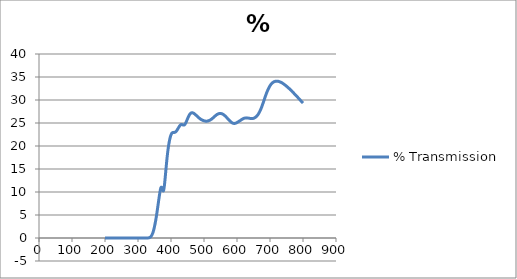
| Category | % Transmission |
|---|---|
| 800.0 | 29.326 |
| 799.0 | 29.408 |
| 798.0 | 29.476 |
| 797.0 | 29.574 |
| 796.0 | 29.648 |
| 795.0 | 29.703 |
| 794.0 | 29.803 |
| 793.0 | 29.878 |
| 792.0 | 29.945 |
| 791.0 | 30.029 |
| 790.0 | 30.11 |
| 789.0 | 30.184 |
| 788.0 | 30.261 |
| 787.0 | 30.337 |
| 786.0 | 30.415 |
| 785.0 | 30.502 |
| 784.0 | 30.579 |
| 783.0 | 30.653 |
| 782.0 | 30.735 |
| 781.0 | 30.801 |
| 780.0 | 30.877 |
| 779.0 | 30.946 |
| 778.0 | 31.04 |
| 777.0 | 31.105 |
| 776.0 | 31.191 |
| 775.0 | 31.268 |
| 774.0 | 31.34 |
| 773.0 | 31.403 |
| 772.0 | 31.506 |
| 771.0 | 31.567 |
| 770.0 | 31.648 |
| 769.0 | 31.703 |
| 768.0 | 31.781 |
| 767.0 | 31.864 |
| 766.0 | 31.947 |
| 765.0 | 31.998 |
| 764.0 | 32.076 |
| 763.0 | 32.148 |
| 762.0 | 32.207 |
| 761.0 | 32.294 |
| 760.0 | 32.377 |
| 759.0 | 32.416 |
| 758.0 | 32.509 |
| 757.0 | 32.553 |
| 756.0 | 32.618 |
| 755.0 | 32.682 |
| 754.0 | 32.762 |
| 753.0 | 32.799 |
| 752.0 | 32.876 |
| 751.0 | 32.955 |
| 750.0 | 32.986 |
| 749.0 | 33.061 |
| 748.0 | 33.12 |
| 747.0 | 33.183 |
| 746.0 | 33.234 |
| 745.0 | 33.306 |
| 744.0 | 33.333 |
| 743.0 | 33.401 |
| 742.0 | 33.46 |
| 741.0 | 33.496 |
| 740.0 | 33.554 |
| 739.0 | 33.592 |
| 738.0 | 33.644 |
| 737.0 | 33.686 |
| 736.0 | 33.751 |
| 735.0 | 33.766 |
| 734.0 | 33.821 |
| 733.0 | 33.849 |
| 732.0 | 33.865 |
| 731.0 | 33.908 |
| 730.0 | 33.945 |
| 729.0 | 33.963 |
| 728.0 | 33.997 |
| 727.0 | 34.025 |
| 726.0 | 34.035 |
| 725.0 | 34.062 |
| 724.0 | 34.072 |
| 723.0 | 34.076 |
| 722.0 | 34.102 |
| 721.0 | 34.095 |
| 720.0 | 34.076 |
| 719.0 | 34.095 |
| 718.0 | 34.097 |
| 717.0 | 34.069 |
| 716.0 | 34.062 |
| 715.0 | 34.036 |
| 714.0 | 34.007 |
| 713.0 | 33.985 |
| 712.0 | 33.97 |
| 711.0 | 33.916 |
| 710.0 | 33.879 |
| 709.0 | 33.832 |
| 708.0 | 33.748 |
| 707.0 | 33.705 |
| 706.0 | 33.644 |
| 705.0 | 33.557 |
| 704.0 | 33.481 |
| 703.0 | 33.396 |
| 702.0 | 33.291 |
| 701.0 | 33.188 |
| 700.0 | 33.091 |
| 699.0 | 32.968 |
| 698.0 | 32.843 |
| 697.0 | 32.706 |
| 696.0 | 32.552 |
| 695.0 | 32.419 |
| 694.0 | 32.263 |
| 693.0 | 32.098 |
| 692.0 | 31.946 |
| 691.0 | 31.771 |
| 690.0 | 31.581 |
| 689.0 | 31.401 |
| 688.0 | 31.191 |
| 687.0 | 31.006 |
| 686.0 | 30.804 |
| 685.0 | 30.601 |
| 684.0 | 30.388 |
| 683.0 | 30.189 |
| 682.0 | 29.962 |
| 681.0 | 29.75 |
| 680.0 | 29.541 |
| 679.0 | 29.327 |
| 678.0 | 29.131 |
| 677.0 | 28.914 |
| 676.0 | 28.712 |
| 675.0 | 28.525 |
| 674.0 | 28.338 |
| 673.0 | 28.148 |
| 672.0 | 27.985 |
| 671.0 | 27.812 |
| 670.0 | 27.651 |
| 669.0 | 27.515 |
| 668.0 | 27.366 |
| 667.0 | 27.229 |
| 666.0 | 27.109 |
| 665.0 | 26.982 |
| 664.0 | 26.867 |
| 663.0 | 26.774 |
| 662.0 | 26.687 |
| 661.0 | 26.591 |
| 660.0 | 26.518 |
| 659.0 | 26.434 |
| 658.0 | 26.355 |
| 657.0 | 26.302 |
| 656.0 | 26.252 |
| 655.0 | 26.197 |
| 654.0 | 26.158 |
| 653.0 | 26.107 |
| 652.0 | 26.06 |
| 651.0 | 26.044 |
| 650.0 | 26.025 |
| 649.0 | 25.998 |
| 648.0 | 25.992 |
| 647.0 | 25.968 |
| 646.0 | 25.962 |
| 645.0 | 25.965 |
| 644.0 | 25.968 |
| 643.0 | 25.969 |
| 642.0 | 25.982 |
| 641.0 | 25.981 |
| 640.0 | 25.982 |
| 639.0 | 26.008 |
| 638.0 | 26.025 |
| 637.0 | 26.036 |
| 636.0 | 26.053 |
| 635.0 | 26.059 |
| 634.0 | 26.062 |
| 633.0 | 26.085 |
| 632.0 | 26.096 |
| 631.0 | 26.098 |
| 630.0 | 26.115 |
| 629.0 | 26.11 |
| 628.0 | 26.105 |
| 627.0 | 26.111 |
| 626.0 | 26.103 |
| 625.0 | 26.088 |
| 624.0 | 26.074 |
| 623.0 | 26.051 |
| 622.0 | 26.023 |
| 621.0 | 26.013 |
| 620.0 | 25.987 |
| 619.0 | 25.951 |
| 618.0 | 25.919 |
| 617.0 | 25.865 |
| 616.0 | 25.828 |
| 615.0 | 25.793 |
| 614.0 | 25.742 |
| 613.0 | 25.693 |
| 612.0 | 25.651 |
| 611.0 | 25.597 |
| 610.0 | 25.542 |
| 609.0 | 25.502 |
| 608.0 | 25.46 |
| 607.0 | 25.411 |
| 606.0 | 25.37 |
| 605.0 | 25.31 |
| 604.0 | 25.26 |
| 603.0 | 25.231 |
| 602.0 | 25.188 |
| 601.0 | 25.145 |
| 600.0 | 25.107 |
| 599.0 | 25.063 |
| 598.0 | 25.024 |
| 597.0 | 25 |
| 596.0 | 24.976 |
| 595.0 | 24.948 |
| 594.0 | 24.934 |
| 593.0 | 24.911 |
| 592.0 | 24.895 |
| 591.0 | 24.911 |
| 590.0 | 24.918 |
| 589.0 | 24.928 |
| 588.0 | 24.948 |
| 587.0 | 24.968 |
| 586.0 | 25.006 |
| 585.0 | 25.066 |
| 584.0 | 25.107 |
| 583.0 | 25.153 |
| 582.0 | 25.215 |
| 581.0 | 25.265 |
| 580.0 | 25.332 |
| 579.0 | 25.408 |
| 578.0 | 25.475 |
| 577.0 | 25.549 |
| 576.0 | 25.631 |
| 575.0 | 25.698 |
| 574.0 | 25.769 |
| 573.0 | 25.862 |
| 572.0 | 25.937 |
| 571.0 | 26.017 |
| 570.0 | 26.093 |
| 569.0 | 26.163 |
| 568.0 | 26.238 |
| 567.0 | 26.322 |
| 566.0 | 26.405 |
| 565.0 | 26.469 |
| 564.0 | 26.537 |
| 563.0 | 26.598 |
| 562.0 | 26.651 |
| 561.0 | 26.723 |
| 560.0 | 26.776 |
| 559.0 | 26.821 |
| 558.0 | 26.882 |
| 557.0 | 26.921 |
| 556.0 | 26.957 |
| 555.0 | 26.992 |
| 554.0 | 27.002 |
| 553.0 | 27.022 |
| 552.0 | 27.051 |
| 551.0 | 27.059 |
| 550.0 | 27.071 |
| 549.0 | 27.073 |
| 548.0 | 27.063 |
| 547.0 | 27.056 |
| 546.0 | 27.047 |
| 545.0 | 27.031 |
| 544.0 | 27.003 |
| 543.0 | 26.979 |
| 542.0 | 26.942 |
| 541.0 | 26.9 |
| 540.0 | 26.875 |
| 539.0 | 26.822 |
| 538.0 | 26.774 |
| 537.0 | 26.725 |
| 536.0 | 26.652 |
| 535.0 | 26.594 |
| 534.0 | 26.549 |
| 533.0 | 26.474 |
| 532.0 | 26.411 |
| 531.0 | 26.348 |
| 530.0 | 26.264 |
| 529.0 | 26.203 |
| 528.0 | 26.142 |
| 527.0 | 26.083 |
| 526.0 | 26.028 |
| 525.0 | 25.963 |
| 524.0 | 25.897 |
| 523.0 | 25.846 |
| 522.0 | 25.803 |
| 521.0 | 25.753 |
| 520.0 | 25.708 |
| 519.0 | 25.661 |
| 518.0 | 25.621 |
| 517.0 | 25.579 |
| 516.0 | 25.566 |
| 515.0 | 25.531 |
| 514.0 | 25.498 |
| 513.0 | 25.48 |
| 512.0 | 25.446 |
| 511.0 | 25.421 |
| 510.0 | 25.419 |
| 509.0 | 25.399 |
| 508.0 | 25.398 |
| 507.0 | 25.396 |
| 506.0 | 25.388 |
| 505.0 | 25.393 |
| 504.0 | 25.418 |
| 503.0 | 25.428 |
| 502.0 | 25.451 |
| 501.0 | 25.465 |
| 500.0 | 25.478 |
| 499.0 | 25.505 |
| 498.0 | 25.55 |
| 497.0 | 25.555 |
| 496.0 | 25.603 |
| 495.0 | 25.636 |
| 494.0 | 25.651 |
| 493.0 | 25.701 |
| 492.0 | 25.744 |
| 491.0 | 25.775 |
| 490.0 | 25.827 |
| 489.0 | 25.874 |
| 488.0 | 25.919 |
| 487.0 | 25.971 |
| 486.0 | 26.037 |
| 485.0 | 26.098 |
| 484.0 | 26.155 |
| 483.0 | 26.218 |
| 482.0 | 26.275 |
| 481.0 | 26.344 |
| 480.0 | 26.43 |
| 479.0 | 26.483 |
| 478.0 | 26.559 |
| 477.0 | 26.63 |
| 476.0 | 26.678 |
| 475.0 | 26.748 |
| 474.0 | 26.837 |
| 473.0 | 26.878 |
| 472.0 | 26.946 |
| 471.0 | 26.998 |
| 470.0 | 27.032 |
| 469.0 | 27.1 |
| 468.0 | 27.143 |
| 467.0 | 27.173 |
| 466.0 | 27.205 |
| 465.0 | 27.22 |
| 464.0 | 27.226 |
| 463.0 | 27.21 |
| 462.0 | 27.209 |
| 461.0 | 27.17 |
| 460.0 | 27.133 |
| 459.0 | 27.074 |
| 458.0 | 26.981 |
| 457.0 | 26.896 |
| 456.0 | 26.797 |
| 455.0 | 26.674 |
| 454.0 | 26.546 |
| 453.0 | 26.4 |
| 452.0 | 26.232 |
| 451.0 | 26.072 |
| 450.0 | 25.916 |
| 449.0 | 25.737 |
| 448.0 | 25.559 |
| 447.0 | 25.384 |
| 446.0 | 25.199 |
| 445.0 | 25.052 |
| 444.0 | 24.932 |
| 443.0 | 24.795 |
| 442.0 | 24.706 |
| 441.0 | 24.64 |
| 440.0 | 24.562 |
| 439.0 | 24.56 |
| 438.0 | 24.565 |
| 437.0 | 24.564 |
| 436.0 | 24.613 |
| 435.0 | 24.623 |
| 434.0 | 24.655 |
| 433.0 | 24.674 |
| 432.0 | 24.693 |
| 431.0 | 24.68 |
| 430.0 | 24.64 |
| 429.0 | 24.601 |
| 428.0 | 24.521 |
| 427.0 | 24.447 |
| 426.0 | 24.354 |
| 425.0 | 24.234 |
| 424.0 | 24.128 |
| 423.0 | 24.006 |
| 422.0 | 23.868 |
| 421.0 | 23.761 |
| 420.0 | 23.657 |
| 419.0 | 23.508 |
| 418.0 | 23.42 |
| 417.0 | 23.302 |
| 416.0 | 23.204 |
| 415.0 | 23.139 |
| 414.0 | 23.082 |
| 413.0 | 23.022 |
| 412.0 | 22.991 |
| 411.0 | 22.97 |
| 410.0 | 22.944 |
| 409.0 | 22.944 |
| 408.0 | 22.963 |
| 407.0 | 22.936 |
| 406.0 | 22.946 |
| 405.0 | 22.91 |
| 404.0 | 22.864 |
| 403.0 | 22.806 |
| 402.0 | 22.723 |
| 401.0 | 22.58 |
| 400.0 | 22.435 |
| 399.0 | 22.227 |
| 398.0 | 21.975 |
| 397.0 | 21.7 |
| 396.0 | 21.393 |
| 395.0 | 21.022 |
| 394.0 | 20.633 |
| 393.0 | 20.22 |
| 392.0 | 19.724 |
| 391.0 | 19.226 |
| 390.0 | 18.666 |
| 389.0 | 18.035 |
| 388.0 | 17.383 |
| 387.0 | 16.671 |
| 386.0 | 15.914 |
| 385.0 | 15.145 |
| 384.0 | 14.372 |
| 383.0 | 13.587 |
| 382.0 | 12.814 |
| 381.0 | 12.082 |
| 380.0 | 11.428 |
| 379.0 | 10.883 |
| 378.0 | 10.458 |
| 377.0 | 10.261 |
| 376.0 | 10.239 |
| 375.0 | 10.362 |
| 374.0 | 10.563 |
| 373.0 | 10.788 |
| 372.0 | 10.975 |
| 371.0 | 11.042 |
| 370.0 | 11.004 |
| 369.0 | 10.837 |
| 368.0 | 10.552 |
| 367.0 | 10.194 |
| 366.0 | 9.764 |
| 365.0 | 9.309 |
| 364.0 | 8.833 |
| 363.0 | 8.341 |
| 362.0 | 7.833 |
| 361.0 | 7.325 |
| 360.0 | 6.816 |
| 359.0 | 6.299 |
| 358.0 | 5.8 |
| 357.0 | 5.316 |
| 356.0 | 4.844 |
| 355.0 | 4.398 |
| 354.0 | 3.968 |
| 353.0 | 3.563 |
| 352.0 | 3.183 |
| 351.0 | 2.826 |
| 350.0 | 2.478 |
| 349.0 | 2.164 |
| 348.0 | 1.863 |
| 347.0 | 1.591 |
| 346.0 | 1.348 |
| 345.0 | 1.139 |
| 344.0 | 0.949 |
| 343.0 | 0.783 |
| 342.0 | 0.639 |
| 341.0 | 0.51 |
| 340.0 | 0.403 |
| 339.0 | 0.317 |
| 338.0 | 0.242 |
| 337.0 | 0.181 |
| 336.0 | 0.132 |
| 335.0 | 0.094 |
| 334.0 | 0.066 |
| 333.0 | 0.049 |
| 332.0 | 0.034 |
| 331.0 | 0.023 |
| 330.0 | 0.015 |
| 329.0 | 0.007 |
| 328.0 | 0.004 |
| 327.0 | 0.006 |
| 326.0 | 0.005 |
| 325.0 | 0.004 |
| 324.0 | 0.002 |
| 323.0 | 0.002 |
| 322.0 | 0.001 |
| 321.0 | 0.005 |
| 320.0 | -0.001 |
| 319.0 | 0.001 |
| 318.0 | 0.002 |
| 317.0 | 0.002 |
| 316.0 | 0.001 |
| 315.0 | -0.001 |
| 314.0 | 0.001 |
| 313.0 | 0 |
| 312.0 | 0.003 |
| 311.0 | 0.002 |
| 310.0 | -0.002 |
| 309.0 | -0.002 |
| 308.0 | 0 |
| 307.0 | 0 |
| 306.0 | 0.004 |
| 305.0 | 0.002 |
| 304.0 | -0.001 |
| 303.0 | -0.001 |
| 302.0 | 0.001 |
| 301.0 | -0.001 |
| 300.0 | 0.002 |
| 299.0 | 0.002 |
| 298.0 | -0.002 |
| 297.0 | -0.002 |
| 296.0 | 0.001 |
| 295.0 | 0 |
| 294.0 | 0.004 |
| 293.0 | 0.003 |
| 292.0 | -0.001 |
| 291.0 | -0.002 |
| 290.0 | 0 |
| 289.0 | 0 |
| 288.0 | 0.004 |
| 287.0 | 0.002 |
| 286.0 | 0.001 |
| 285.0 | 0 |
| 284.0 | 0.001 |
| 283.0 | 0 |
| 282.0 | 0.004 |
| 281.0 | 0.003 |
| 280.0 | 0 |
| 279.0 | -0.001 |
| 278.0 | 0.001 |
| 277.0 | 0.001 |
| 276.0 | 0.003 |
| 275.0 | 0.002 |
| 274.0 | 0 |
| 273.0 | 0.001 |
| 272.0 | 0.002 |
| 271.0 | 0.003 |
| 270.0 | 0.002 |
| 269.0 | 0.002 |
| 268.0 | 0.002 |
| 267.0 | 0.002 |
| 266.0 | 0.004 |
| 265.0 | 0.004 |
| 264.0 | 0.005 |
| 263.0 | 0.003 |
| 262.0 | -0.001 |
| 261.0 | -0.001 |
| 260.0 | 0 |
| 259.0 | 0 |
| 258.0 | 0.004 |
| 257.0 | 0.003 |
| 256.0 | -0.001 |
| 255.0 | -0.001 |
| 254.0 | 0.001 |
| 253.0 | 0.001 |
| 252.0 | 0.004 |
| 251.0 | 0.002 |
| 250.0 | -0.001 |
| 299.0 | 0.001 |
| 298.0 | -0.002 |
| 297.0 | 0 |
| 296.0 | 0.001 |
| 295.0 | -0.001 |
| 294.0 | 0.002 |
| 293.0 | 0.001 |
| 292.0 | -0.002 |
| 291.0 | 0.002 |
| 290.0 | 0.003 |
| 289.0 | -0.002 |
| 288.0 | -0.002 |
| 287.0 | 0 |
| 286.0 | 0.001 |
| 285.0 | 0.001 |
| 284.0 | 0 |
| 283.0 | 0.001 |
| 282.0 | 0.001 |
| 281.0 | -0.001 |
| 280.0 | -0.003 |
| 279.0 | 0 |
| 278.0 | 0.002 |
| 277.0 | 0 |
| 276.0 | 0.002 |
| 275.0 | 0.001 |
| 274.0 | -0.001 |
| 273.0 | 0.002 |
| 272.0 | 0.002 |
| 271.0 | 0 |
| 270.0 | 0.002 |
| 269.0 | 0.001 |
| 268.0 | -0.002 |
| 267.0 | 0.001 |
| 266.0 | 0.001 |
| 265.0 | 0 |
| 264.0 | 0.002 |
| 263.0 | 0.001 |
| 262.0 | -0.001 |
| 261.0 | 0.001 |
| 260.0 | 0.001 |
| 259.0 | -0.001 |
| 258.0 | 0.001 |
| 257.0 | -0.001 |
| 256.0 | -0.001 |
| 255.0 | 0 |
| 254.0 | -0.002 |
| 253.0 | -0.001 |
| 252.0 | 0.003 |
| 251.0 | 0.002 |
| 250.0 | 0 |
| 249.0 | 0.002 |
| 248.0 | 0 |
| 247.0 | 0 |
| 246.0 | 0.002 |
| 245.0 | -0.001 |
| 244.0 | -0.003 |
| 243.0 | -0.001 |
| 242.0 | -0.002 |
| 241.0 | 0 |
| 240.0 | 0.003 |
| 239.0 | 0 |
| 238.0 | -0.002 |
| 237.0 | -0.001 |
| 236.0 | -0.001 |
| 235.0 | 0 |
| 234.0 | 0.002 |
| 233.0 | 0 |
| 232.0 | -0.002 |
| 231.0 | 0.001 |
| 230.0 | -0.001 |
| 229.0 | 0 |
| 228.0 | 0.003 |
| 227.0 | 0.001 |
| 226.0 | -0.001 |
| 225.0 | -0.001 |
| 224.0 | -0.002 |
| 223.0 | 0 |
| 222.0 | 0.002 |
| 221.0 | 0.001 |
| 220.0 | -0.001 |
| 219.0 | 0 |
| 218.0 | -0.001 |
| 217.0 | 0 |
| 216.0 | 0.002 |
| 215.0 | 0 |
| 214.0 | -0.001 |
| 213.0 | 0 |
| 212.0 | -0.002 |
| 211.0 | 0.001 |
| 210.0 | 0.002 |
| 209.0 | 0 |
| 208.0 | -0.003 |
| 207.0 | 0.001 |
| 206.0 | 0 |
| 205.0 | -0.002 |
| 204.0 | 0 |
| 203.0 | -0.001 |
| 202.0 | 0 |
| 201.0 | 0 |
| 200.0 | -0.004 |